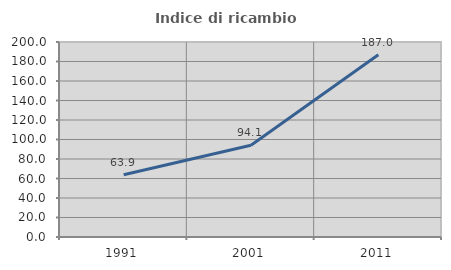
| Category | Indice di ricambio occupazionale  |
|---|---|
| 1991.0 | 63.889 |
| 2001.0 | 94.118 |
| 2011.0 | 186.957 |